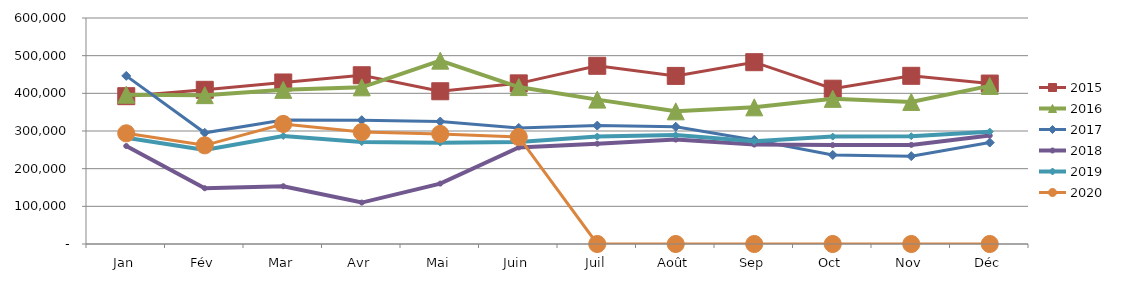
| Category | 2015 | 2016 | 2017 | 2018 | 2019 | 2020 |
|---|---|---|---|---|---|---|
| Jan | 392455.386 | 396263.914 | 446281.806 | 260114.073 | 282172.738 | 293841.353 |
| Fév | 409347.179 | 395175.975 | 295222.519 | 148036.843 | 249871.665 | 261954.608 |
| Mar | 428838.698 | 409222.091 | 329338.872 | 153395.928 | 286777.302 | 318758.795 |
| Avr | 448014.817 | 415901.642 | 328702.589 | 109982.902 | 270782.686 | 297258.355 |
| Mai | 405528.286 | 486763.336 | 325158.457 | 160382.707 | 269027.301 | 292304.897 |
| Juin | 426462.87 | 416602.613 | 308100.463 | 256426.409 | 271108.83 | 284186.488 |
| Juil | 473107.942 | 383313.72 | 314407.38 | 266269.669 | 285234.508 | 0 |
| Août | 446267.927 | 352198.565 | 311304.785 | 277231.878 | 289072.19 | 0 |
| Sep | 482677.503 | 362763.978 | 276260.727 | 263963.731 | 272549.159 | 0 |
| Oct | 412311.701 | 385353.331 | 236379.756 | 262549.621 | 285123.451 | 0 |
| Nov | 446526.169 | 377201.543 | 233251.128 | 263155.863 | 286119.242 | 0 |
| Déc | 425963.85 | 419714.854 | 269424.356 | 287963.859 | 298314.346 | 0 |